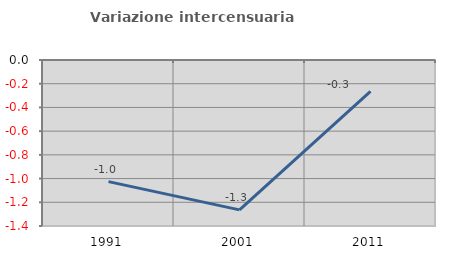
| Category | Variazione intercensuaria annua |
|---|---|
| 1991.0 | -1.026 |
| 2001.0 | -1.264 |
| 2011.0 | -0.265 |